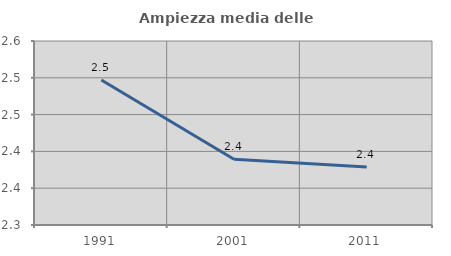
| Category | Ampiezza media delle famiglie |
|---|---|
| 1991.0 | 2.497 |
| 2001.0 | 2.389 |
| 2011.0 | 2.379 |